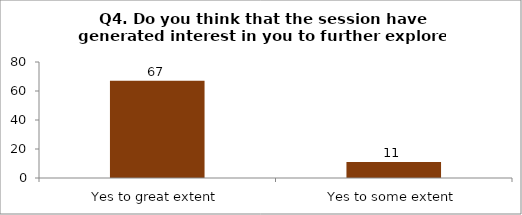
| Category | Q4. Do you think that the session have generated interest in you to further explore the topics? |
|---|---|
| Yes to great extent | 67 |
| Yes to some extent | 11 |